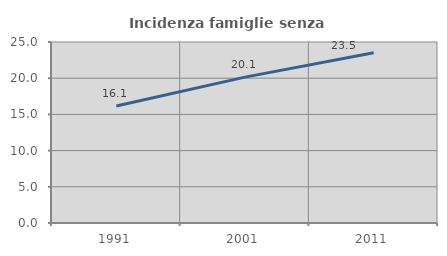
| Category | Incidenza famiglie senza nuclei |
|---|---|
| 1991.0 | 16.15 |
| 2001.0 | 20.148 |
| 2011.0 | 23.507 |